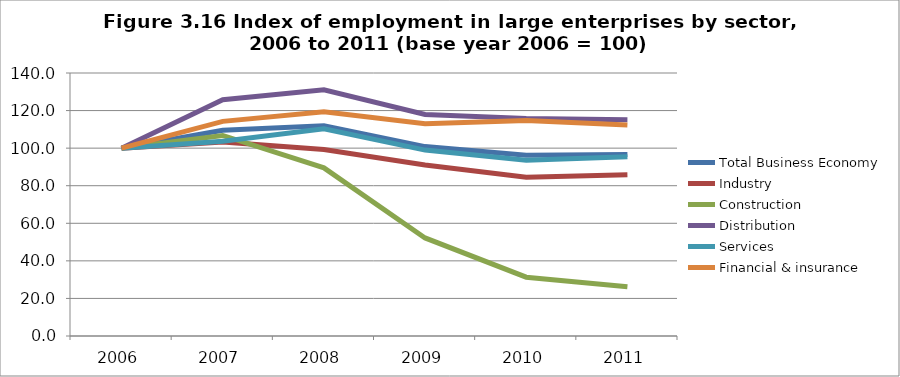
| Category | Total Business Economy | Industry | Construction | Distribution | Services | Financial & insurance  |
|---|---|---|---|---|---|---|
| 2006.0 | 100 | 100 | 100 | 100 | 100 | 100 |
| 2007.0 | 109.469 | 103.272 | 106.742 | 125.776 | 103.648 | 114.261 |
| 2008.0 | 111.906 | 99.24 | 89.509 | 131.029 | 110.259 | 119.309 |
| 2009.0 | 100.832 | 90.997 | 52.201 | 117.946 | 98.969 | 112.968 |
| 2010.0 | 96.241 | 84.482 | 31.301 | 115.804 | 93.57 | 114.773 |
| 2011.0 | 96.581 | 85.787 | 26.172 | 115.103 | 95.432 | 112.347 |